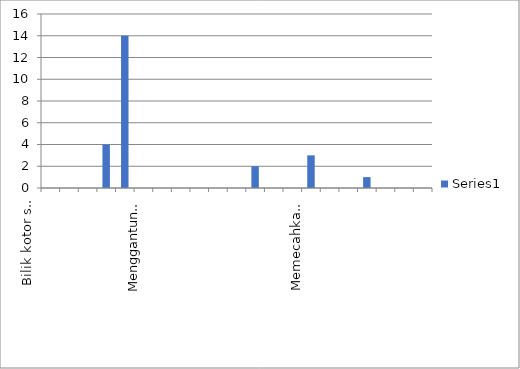
| Category | Series 0 |
|---|---|
| Bilik kotor semasa pemulangan kunci | 0 |
| Merosakkan kemudahan yang disediakan di dalam bilik | 0 |
| Menghilangkan barangan pinjaman/sewaan | 0 |
| Menukar bilik tanpa kebenaran | 4 |
| Memiliki periuk elektrik/seterika/peti sejuk/TV  | 14 |
| Menampal poster tanpa kebenaran | 0 |
| Meninggalkan bilik tanpa menutup suis lampu dan kipas | 0 |
| Menggantung atau menggeringkan pakaian di tingkap, balkoni dan bilik rehat  | 0 |
| Memasuki blok lain jantina* | 0 |
| Kehilangan kunci | 0 |
| Tertinggal kunci di dalam bilik dan meminjam kunci sementara di pejabat | 0 |
| Menukar susun atur kemudahan bilik  | 2 |
| Menyimpan motorsikal dan basikal di dalam bilik/kawasan blok penginapan  | 0 |
| Meletakkan kenderaan di tempat letak kereta staf/felo kolej | 0 |
| Memecahkan cermin tingkap | 3 |
| Memiliki makanan dan minuman tidak halal | 0 |
| Memasak makanan di dalam blok penginapan | 0 |
| Membenarkan pelajar yang tidak berdaftar tinggal di dalam kolej | 1 |
| Merokok di dalam kawasan kolej  | 0 |
| Pulang lewat selepas jam 12 malam tanpa kebenaran | 0 |
| Melanggar etika penampilan pelajar UPM | 0 |